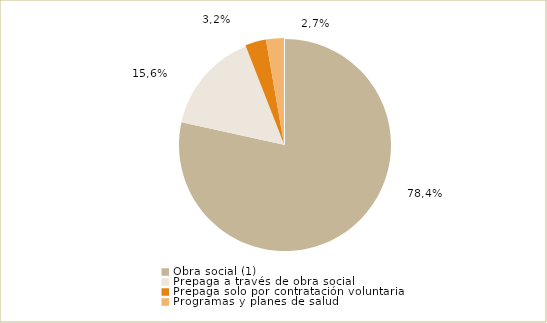
| Category | Series 0 |
|---|---|
| Obra social (1) | 78.443 |
| Prepaga a través de obra social | 15.638 |
| Prepaga solo por contratación voluntaria | 3.192 |
| Programas y planes de salud | 2.727 |